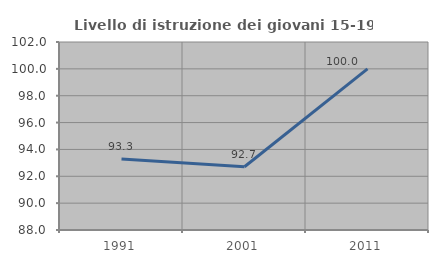
| Category | Livello di istruzione dei giovani 15-19 anni |
|---|---|
| 1991.0 | 93.284 |
| 2001.0 | 92.708 |
| 2011.0 | 100 |